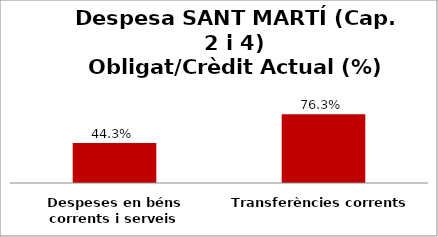
| Category | Series 0 |
|---|---|
| Despeses en béns corrents i serveis | 0.443 |
| Transferències corrents | 0.763 |